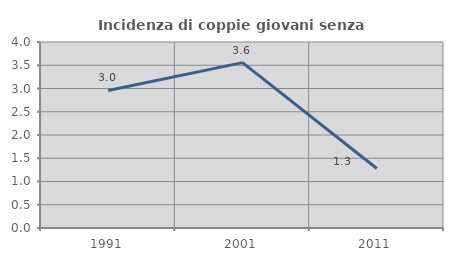
| Category | Incidenza di coppie giovani senza figli |
|---|---|
| 1991.0 | 2.959 |
| 2001.0 | 3.556 |
| 2011.0 | 1.279 |